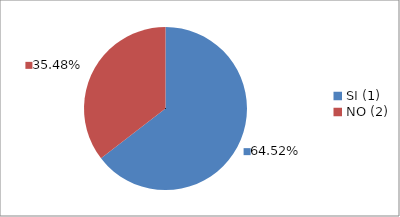
| Category | Series 0 |
|---|---|
| SI (1) | 0.645 |
| NO (2) | 0.355 |